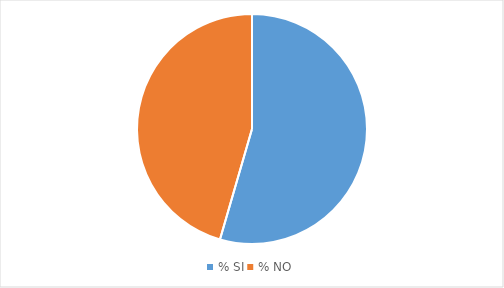
| Category | Series 0 | Series 1 | Series 2 | Series 3 | Series 4 | Series 5 | Series 6 | Series 7 | Series 8 | Series 9 |
|---|---|---|---|---|---|---|---|---|---|---|
| % SI | 2.91 | 2.91 | 4.85 | 5.83 | 7.77 | 9.22 | 8.74 | 11.17 | 7.28 | 6.8 |
| % NO | 2.43 | 3.4 | 3.4 | 7.28 | 2.43 | 3.88 | 0.97 | 2.91 | 0.97 | 4.85 |